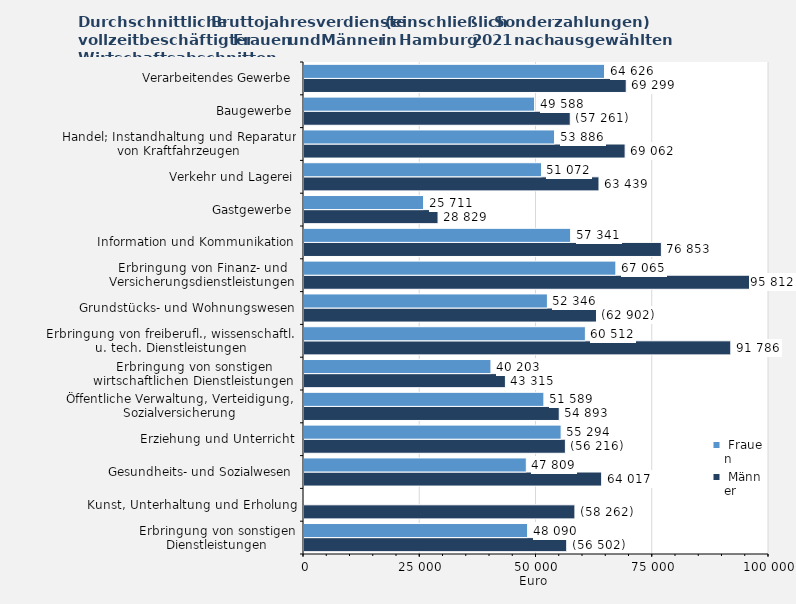
| Category |  Männer |  Frauen |
|---|---|---|
| Erbringung von sonstigen Dienstleistungen | 56502 | 48090 |
| Kunst, Unterhaltung und Erholung | 58262 | 0 |
| Gesundheits- und Sozialwesen | 64017 | 47809 |
| Erziehung und Unterricht | 56216 | 55294 |
| Öffentliche Verwaltung, Verteidigung, Sozialversicherung | 54893 | 51589 |
| Erbringung von sonstigen wirtschaftlichen Dienstleistungen | 43315 | 40203 |
| Erbringung von freiberufl., wissenschaftl. u. tech. Dienstleistungen | 91786 | 60512 |
| Grundstücks- und Wohnungswesen | 62902 | 52346 |
| Erbringung von Finanz- und Versicherungsdienstleistungen | 95812 | 67065 |
| Information und Kommunikation | 76853 | 57341 |
| Gastgewerbe | 28829 | 25711 |
| Verkehr und Lagerei | 63439 | 51072 |
| Handel; Instandhaltung und Reparatur von Kraftfahrzeugen | 69062 | 53886 |
| Baugewerbe | 57261 | 49588 |
| Verarbeitendes Gewerbe | 69299 | 64626 |